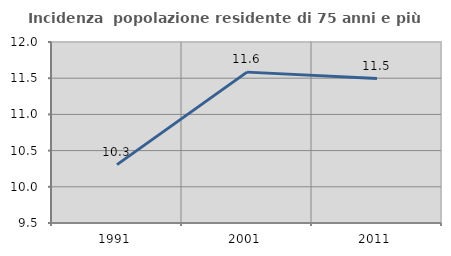
| Category | Incidenza  popolazione residente di 75 anni e più |
|---|---|
| 1991.0 | 10.306 |
| 2001.0 | 11.584 |
| 2011.0 | 11.495 |